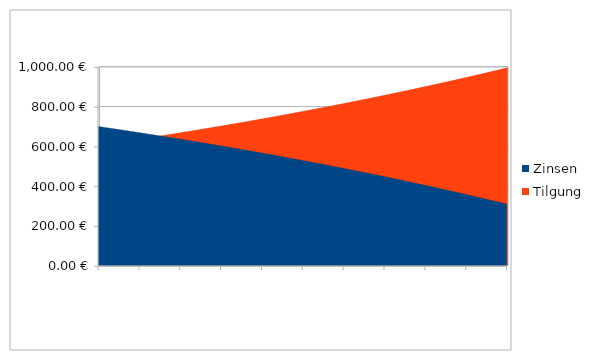
| Category | Zinsen | Tilgung |
|---|---|---|
| 2016-05-01 | 697.917 | 602.083 |
| 2016-06-01 | 696.662 | 603.338 |
| 2016-07-01 | 695.405 | 604.595 |
| 2016-08-01 | 694.146 | 605.854 |
| 2016-09-01 | 692.884 | 607.116 |
| 2016-10-01 | 691.619 | 608.381 |
| 2016-11-01 | 690.351 | 609.649 |
| 2016-12-01 | 689.081 | 610.919 |
| 2017-01-01 | 687.808 | 612.192 |
| 2017-02-01 | 686.533 | 613.467 |
| 2017-03-01 | 685.255 | 614.745 |
| 2017-04-01 | 683.974 | 616.026 |
| 2017-05-01 | 682.691 | 617.309 |
| 2017-06-01 | 681.405 | 618.595 |
| 2017-07-01 | 680.116 | 619.884 |
| 2017-08-01 | 678.825 | 621.175 |
| 2017-09-01 | 677.531 | 622.469 |
| 2017-10-01 | 676.234 | 623.766 |
| 2017-11-01 | 674.934 | 625.066 |
| 2017-12-01 | 673.632 | 626.368 |
| 2018-01-01 | 672.327 | 627.673 |
| 2018-02-01 | 671.019 | 628.981 |
| 2018-03-01 | 669.709 | 630.291 |
| 2018-04-01 | 668.396 | 631.604 |
| 2018-05-01 | 667.08 | 632.92 |
| 2018-06-01 | 665.762 | 634.238 |
| 2018-07-01 | 664.44 | 635.56 |
| 2018-08-01 | 663.116 | 636.884 |
| 2018-09-01 | 661.789 | 638.211 |
| 2018-10-01 | 660.46 | 639.54 |
| 2018-11-01 | 659.127 | 640.873 |
| 2018-12-01 | 657.792 | 642.208 |
| 2019-01-01 | 656.454 | 643.546 |
| 2019-02-01 | 655.113 | 644.887 |
| 2019-03-01 | 653.77 | 646.23 |
| 2019-04-01 | 652.424 | 647.576 |
| 2019-05-01 | 651.075 | 648.925 |
| 2019-06-01 | 649.723 | 650.277 |
| 2019-07-01 | 648.368 | 651.632 |
| 2019-08-01 | 647.01 | 652.99 |
| 2019-09-01 | 645.65 | 654.35 |
| 2019-10-01 | 644.287 | 655.713 |
| 2019-11-01 | 642.921 | 657.079 |
| 2019-12-01 | 641.552 | 658.448 |
| 2020-01-01 | 640.18 | 659.82 |
| 2020-02-01 | 638.805 | 661.195 |
| 2020-03-01 | 637.428 | 662.572 |
| 2020-04-01 | 636.047 | 663.953 |
| 2020-05-01 | 634.664 | 665.336 |
| 2020-06-01 | 633.278 | 666.722 |
| 2020-07-01 | 631.889 | 668.111 |
| 2020-08-01 | 630.497 | 669.503 |
| 2020-09-01 | 629.102 | 670.898 |
| 2020-10-01 | 627.705 | 672.295 |
| 2020-11-01 | 626.304 | 673.696 |
| 2020-12-01 | 624.901 | 675.099 |
| 2021-01-01 | 623.494 | 676.506 |
| 2021-02-01 | 622.085 | 677.915 |
| 2021-03-01 | 620.672 | 679.328 |
| 2021-04-01 | 619.257 | 680.743 |
| 2021-05-01 | 617.839 | 682.161 |
| 2021-06-01 | 616.418 | 683.582 |
| 2021-07-01 | 614.994 | 685.006 |
| 2021-08-01 | 613.567 | 686.433 |
| 2021-09-01 | 612.136 | 687.864 |
| 2021-10-01 | 610.703 | 689.297 |
| 2021-11-01 | 609.267 | 690.733 |
| 2021-12-01 | 607.828 | 692.172 |
| 2022-01-01 | 606.386 | 693.614 |
| 2022-02-01 | 604.941 | 695.059 |
| 2022-03-01 | 603.493 | 696.507 |
| 2022-04-01 | 602.042 | 697.958 |
| 2022-05-01 | 600.588 | 699.412 |
| 2022-06-01 | 599.131 | 700.869 |
| 2022-07-01 | 597.671 | 702.329 |
| 2022-08-01 | 596.208 | 703.792 |
| 2022-09-01 | 594.741 | 705.259 |
| 2022-10-01 | 593.272 | 706.728 |
| 2022-11-01 | 591.8 | 708.2 |
| 2022-12-01 | 590.324 | 709.676 |
| 2023-01-01 | 588.846 | 711.154 |
| 2023-02-01 | 587.364 | 712.636 |
| 2023-03-01 | 585.88 | 714.12 |
| 2023-04-01 | 584.392 | 715.608 |
| 2023-05-01 | 582.901 | 717.099 |
| 2023-06-01 | 581.407 | 718.593 |
| 2023-07-01 | 579.91 | 720.09 |
| 2023-08-01 | 578.41 | 721.59 |
| 2023-09-01 | 576.907 | 723.093 |
| 2023-10-01 | 575.4 | 724.6 |
| 2023-11-01 | 573.891 | 726.109 |
| 2023-12-01 | 572.378 | 727.622 |
| 2024-01-01 | 570.862 | 729.138 |
| 2024-02-01 | 569.343 | 730.657 |
| 2024-03-01 | 567.821 | 732.179 |
| 2024-04-01 | 566.295 | 733.705 |
| 2024-05-01 | 564.767 | 735.233 |
| 2024-06-01 | 563.235 | 736.765 |
| 2024-07-01 | 561.7 | 738.3 |
| 2024-08-01 | 560.162 | 739.838 |
| 2024-09-01 | 558.621 | 741.379 |
| 2024-10-01 | 557.076 | 742.924 |
| 2024-11-01 | 555.528 | 744.472 |
| 2024-12-01 | 553.977 | 746.023 |
| 2025-01-01 | 552.423 | 747.577 |
| 2025-02-01 | 550.866 | 749.134 |
| 2025-03-01 | 549.305 | 750.695 |
| 2025-04-01 | 547.741 | 752.259 |
| 2025-05-01 | 546.174 | 753.826 |
| 2025-06-01 | 544.603 | 755.397 |
| 2025-07-01 | 543.03 | 756.97 |
| 2025-08-01 | 541.453 | 758.547 |
| 2025-09-01 | 539.872 | 760.128 |
| 2025-10-01 | 538.289 | 761.711 |
| 2025-11-01 | 536.702 | 763.298 |
| 2025-12-01 | 535.112 | 764.888 |
| 2026-01-01 | 533.518 | 766.482 |
| 2026-02-01 | 531.921 | 768.079 |
| 2026-03-01 | 530.321 | 769.679 |
| 2026-04-01 | 528.718 | 771.282 |
| 2026-05-01 | 527.111 | 772.889 |
| 2026-06-01 | 525.501 | 774.499 |
| 2026-07-01 | 523.887 | 776.113 |
| 2026-08-01 | 522.27 | 777.73 |
| 2026-09-01 | 520.65 | 779.35 |
| 2026-10-01 | 519.026 | 780.974 |
| 2026-11-01 | 517.399 | 782.601 |
| 2026-12-01 | 515.769 | 784.231 |
| 2027-01-01 | 514.135 | 785.865 |
| 2027-02-01 | 512.498 | 787.502 |
| 2027-03-01 | 510.857 | 789.143 |
| 2027-04-01 | 509.213 | 790.787 |
| 2027-05-01 | 507.566 | 792.434 |
| 2027-06-01 | 505.915 | 794.085 |
| 2027-07-01 | 504.26 | 795.74 |
| 2027-08-01 | 502.602 | 797.398 |
| 2027-09-01 | 500.941 | 799.059 |
| 2027-10-01 | 499.277 | 800.723 |
| 2027-11-01 | 497.608 | 802.392 |
| 2027-12-01 | 495.937 | 804.063 |
| 2028-01-01 | 494.262 | 805.738 |
| 2028-02-01 | 492.583 | 807.417 |
| 2028-03-01 | 490.901 | 809.099 |
| 2028-04-01 | 489.215 | 810.785 |
| 2028-05-01 | 487.526 | 812.474 |
| 2028-06-01 | 485.833 | 814.167 |
| 2028-07-01 | 484.137 | 815.863 |
| 2028-08-01 | 482.438 | 817.562 |
| 2028-09-01 | 480.734 | 819.266 |
| 2028-10-01 | 479.027 | 820.973 |
| 2028-11-01 | 477.317 | 822.683 |
| 2028-12-01 | 475.603 | 824.397 |
| 2029-01-01 | 473.886 | 826.114 |
| 2029-02-01 | 472.165 | 827.835 |
| 2029-03-01 | 470.44 | 829.56 |
| 2029-04-01 | 468.712 | 831.288 |
| 2029-05-01 | 466.98 | 833.02 |
| 2029-06-01 | 465.244 | 834.756 |
| 2029-07-01 | 463.505 | 836.495 |
| 2029-08-01 | 461.763 | 838.237 |
| 2029-09-01 | 460.016 | 839.984 |
| 2029-10-01 | 458.266 | 841.734 |
| 2029-11-01 | 456.513 | 843.487 |
| 2029-12-01 | 454.755 | 845.245 |
| 2030-01-01 | 452.995 | 847.005 |
| 2030-02-01 | 451.23 | 848.77 |
| 2030-03-01 | 449.462 | 850.538 |
| 2030-04-01 | 447.69 | 852.31 |
| 2030-05-01 | 445.914 | 854.086 |
| 2030-06-01 | 444.135 | 855.865 |
| 2030-07-01 | 442.352 | 857.648 |
| 2030-08-01 | 440.565 | 859.435 |
| 2030-09-01 | 438.774 | 861.226 |
| 2030-10-01 | 436.98 | 863.02 |
| 2030-11-01 | 435.182 | 864.818 |
| 2030-12-01 | 433.381 | 866.619 |
| 2031-01-01 | 431.575 | 868.425 |
| 2031-02-01 | 429.766 | 870.234 |
| 2031-03-01 | 427.953 | 872.047 |
| 2031-04-01 | 426.136 | 873.864 |
| 2031-05-01 | 424.316 | 875.684 |
| 2031-06-01 | 422.491 | 877.509 |
| 2031-07-01 | 420.663 | 879.337 |
| 2031-08-01 | 418.831 | 881.169 |
| 2031-09-01 | 416.995 | 883.005 |
| 2031-10-01 | 415.156 | 884.844 |
| 2031-11-01 | 413.312 | 886.688 |
| 2031-12-01 | 411.465 | 888.535 |
| 2032-01-01 | 409.614 | 890.386 |
| 2032-02-01 | 407.759 | 892.241 |
| 2032-03-01 | 405.9 | 894.1 |
| 2032-04-01 | 404.037 | 895.963 |
| 2032-05-01 | 402.171 | 897.829 |
| 2032-06-01 | 400.3 | 899.7 |
| 2032-07-01 | 398.426 | 901.574 |
| 2032-08-01 | 396.548 | 903.452 |
| 2032-09-01 | 394.666 | 905.334 |
| 2032-10-01 | 392.779 | 907.221 |
| 2032-11-01 | 390.889 | 909.111 |
| 2032-12-01 | 388.995 | 911.005 |
| 2033-01-01 | 387.097 | 912.903 |
| 2033-02-01 | 385.196 | 914.804 |
| 2033-03-01 | 383.29 | 916.71 |
| 2033-04-01 | 381.38 | 918.62 |
| 2033-05-01 | 379.466 | 920.534 |
| 2033-06-01 | 377.548 | 922.452 |
| 2033-07-01 | 375.627 | 924.373 |
| 2033-08-01 | 373.701 | 926.299 |
| 2033-09-01 | 371.771 | 928.229 |
| 2033-10-01 | 369.837 | 930.163 |
| 2033-11-01 | 367.899 | 932.101 |
| 2033-12-01 | 365.958 | 934.042 |
| 2034-01-01 | 364.012 | 935.988 |
| 2034-02-01 | 362.062 | 937.938 |
| 2034-03-01 | 360.108 | 939.892 |
| 2034-04-01 | 358.149 | 941.851 |
| 2034-05-01 | 356.187 | 943.813 |
| 2034-06-01 | 354.221 | 945.779 |
| 2034-07-01 | 352.251 | 947.749 |
| 2034-08-01 | 350.276 | 949.724 |
| 2034-09-01 | 348.298 | 951.702 |
| 2034-10-01 | 346.315 | 953.685 |
| 2034-11-01 | 344.328 | 955.672 |
| 2034-12-01 | 342.337 | 957.663 |
| 2035-01-01 | 340.342 | 959.658 |
| 2035-02-01 | 338.343 | 961.657 |
| 2035-03-01 | 336.339 | 963.661 |
| 2035-04-01 | 334.332 | 965.668 |
| 2035-05-01 | 332.32 | 967.68 |
| 2035-06-01 | 330.304 | 969.696 |
| 2035-07-01 | 328.284 | 971.716 |
| 2035-08-01 | 326.259 | 973.741 |
| 2035-09-01 | 324.23 | 975.77 |
| 2035-10-01 | 322.198 | 977.802 |
| 2035-11-01 | 320.161 | 979.839 |
| 2035-12-01 | 318.119 | 981.881 |
| 2036-01-01 | 316.074 | 983.926 |
| 2036-02-01 | 314.024 | 985.976 |
| 2036-03-01 | 311.97 | 988.03 |
| 2036-04-01 | 309.911 | 990.089 |
| 2036-05-01 | 307.849 | 992.151 |